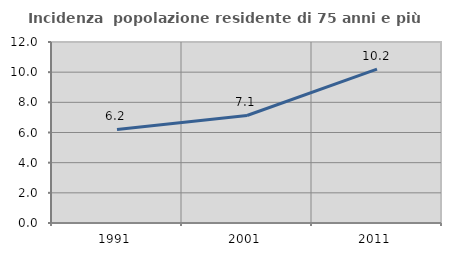
| Category | Incidenza  popolazione residente di 75 anni e più |
|---|---|
| 1991.0 | 6.199 |
| 2001.0 | 7.129 |
| 2011.0 | 10.2 |